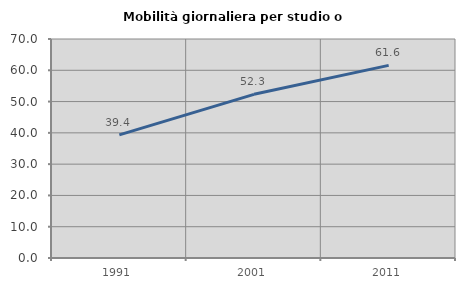
| Category | Mobilità giornaliera per studio o lavoro |
|---|---|
| 1991.0 | 39.361 |
| 2001.0 | 52.319 |
| 2011.0 | 61.564 |